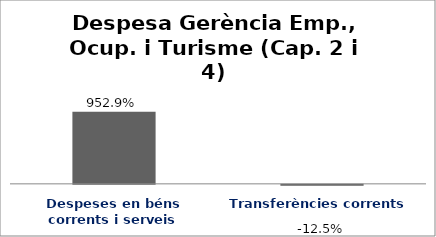
| Category | Series 0 |
|---|---|
| Despeses en béns corrents i serveis | 9.529 |
| Transferències corrents | -0.125 |